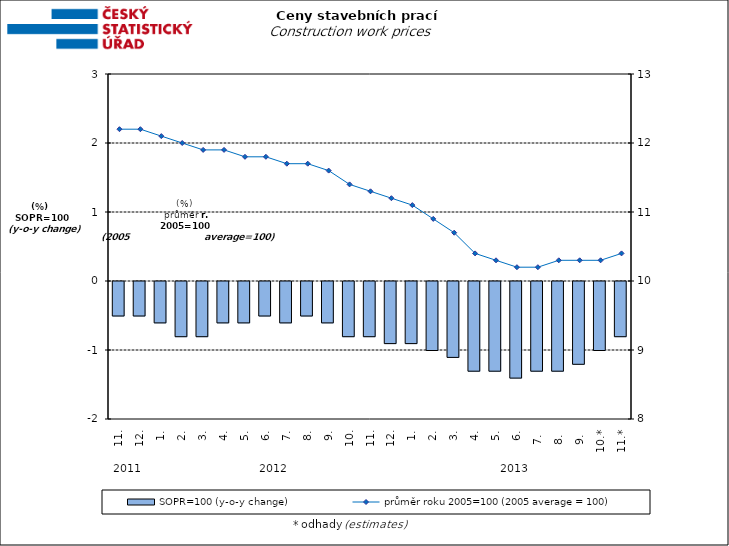
| Category | SOPR=100 (y-o-y change)   |
|---|---|
| 0 | -0.5 |
| 1 | -0.5 |
| 2 | -0.6 |
| 3 | -0.8 |
| 4 | -0.8 |
| 5 | -0.6 |
| 6 | -0.6 |
| 7 | -0.5 |
| 8 | -0.6 |
| 9 | -0.5 |
| 10 | -0.6 |
| 11 | -0.8 |
| 12 | -0.8 |
| 13 | -0.9 |
| 14 | -0.9 |
| 15 | -1 |
| 16 | -1.1 |
| 17 | -1.3 |
| 18 | -1.3 |
| 19 | -1.4 |
| 20 | -1.3 |
| 21 | -1.3 |
| 22 | -1.2 |
| 23 | -1 |
| 24 | -0.8 |